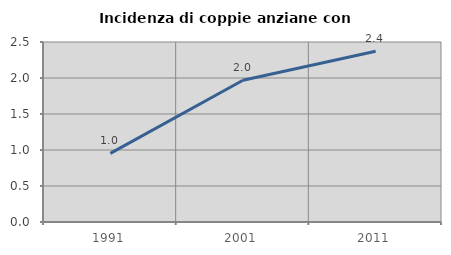
| Category | Incidenza di coppie anziane con figli |
|---|---|
| 1991.0 | 0.952 |
| 2001.0 | 1.969 |
| 2011.0 | 2.372 |